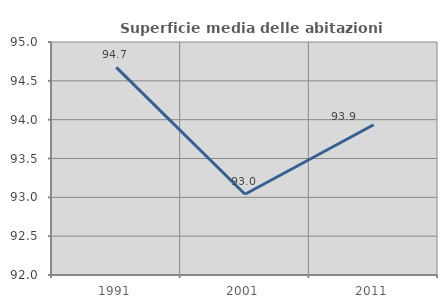
| Category | Superficie media delle abitazioni occupate |
|---|---|
| 1991.0 | 94.674 |
| 2001.0 | 93.04 |
| 2011.0 | 93.935 |